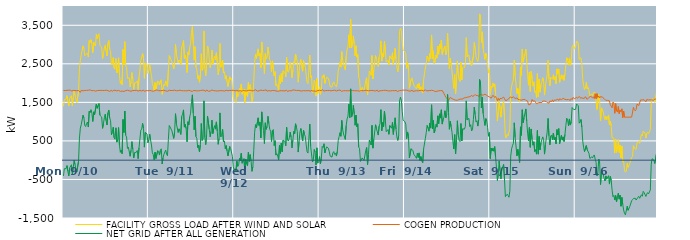
| Category | FACILITY GROSS LOAD AFTER WIND AND SOLAR | COGEN PRODUCTION | NET GRID AFTER ALL GENERATION |
|---|---|---|---|
|  Mon  9/10 | 1402 | 1811 | -409 |
|  Mon  9/10 | 1571 | 1792 | -221 |
|  Mon  9/10 | 1563 | 1806 | -243 |
|  Mon  9/10 | 1587 | 1807 | -220 |
|  Mon  9/10 | 1673 | 1813 | -140 |
|  Mon  9/10 | 1524 | 1812 | -288 |
|  Mon  9/10 | 1406 | 1814 | -408 |
|  Mon  9/10 | 1601 | 1801 | -200 |
|  Mon  9/10 | 1600 | 1819 | -219 |
|  Mon  9/10 | 1674 | 1792 | -118 |
|  Mon  9/10 | 1409 | 1793 | -384 |
|  Mon  9/10 | 1620 | 1809 | -189 |
|  Mon  9/10 | 1791 | 1793 | -2 |
|  Mon  9/10 | 1692 | 1805 | -113 |
|  Mon  9/10 | 1586 | 1807 | -221 |
|  Mon  9/10 | 1495 | 1803 | -308 |
|  Mon  9/10 | 1517 | 1806 | -289 |
|  Mon  9/10 | 1781 | 1807 | -26 |
|  Mon  9/10 | 2385 | 1811 | 574 |
|  Mon  9/10 | 2591 | 1760 | 831 |
|  Mon  9/10 | 2730 | 1811 | 919 |
|  Mon  9/10 | 2745 | 1807 | 938 |
|  Mon  9/10 | 2965 | 1799 | 1166 |
|  Mon  9/10 | 2897 | 1798 | 1099 |
|  Mon  9/10 | 2711 | 1810 | 901 |
|  Mon  9/10 | 2691 | 1819 | 872 |
|  Mon  9/10 | 2758 | 1809 | 949 |
|  Mon  9/10 | 2785 | 1795 | 990 |
|  Mon  9/10 | 2675 | 1815 | 860 |
|  Mon  9/10 | 3101 | 1830 | 1271 |
|  Mon  9/10 | 3053 | 1822 | 1231 |
|  Mon  9/10 | 3128 | 1816 | 1312 |
|  Mon  9/10 | 3024 | 1803 | 1221 |
|  Mon  9/10 | 2791 | 1787 | 1004 |
|  Mon  9/10 | 3061 | 1807 | 1254 |
|  Mon  9/10 | 2989 | 1809 | 1180 |
|  Mon  9/10 | 2958 | 1791 | 1167 |
|  Mon  9/10 | 3271 | 1815 | 1456 |
|  Mon  9/10 | 3151 | 1805 | 1346 |
|  Mon  9/10 | 3233 | 1816 | 1417 |
|  Mon  9/10 | 3281 | 1811 | 1470 |
|  Mon  9/10 | 2977 | 1811 | 1166 |
|  Mon  9/10 | 2992 | 1809 | 1183 |
|  Mon  9/10 | 2933 | 1813 | 1120 |
|  Mon  9/10 | 2636 | 1810 | 826 |
|  Mon  9/10 | 2767 | 1813 | 954 |
|  Mon  9/10 | 2909 | 1807 | 1102 |
|  Mon  9/10 | 2980 | 1788 | 1192 |
|  Mon  9/10 | 2840 | 1816 | 1024 |
|  Mon  9/10 | 2704 | 1792 | 912 |
|  Mon  9/10 | 3032 | 1806 | 1226 |
|  Mon  9/10 | 3105 | 1806 | 1299 |
|  Mon  9/10 | 2882 | 1785 | 1097 |
|  Mon  9/10 | 2820 | 1797 | 1023 |
|  Mon  9/10 | 2474 | 1815 | 659 |
|  Mon  9/10 | 2525 | 1783 | 742 |
|  Mon  9/10 | 2663 | 1809 | 854 |
|  Mon  9/10 | 2389 | 1806 | 583 |
|  Mon  9/10 | 2359 | 1815 | 544 |
|  Mon  9/10 | 2638 | 1798 | 840 |
|  Mon  9/10 | 2266 | 1798 | 468 |
|  Mon  9/10 | 2331 | 1810 | 521 |
|  Mon  9/10 | 2659 | 1811 | 848 |
|  Mon  9/10 | 2204 | 1814 | 390 |
|  Mon  9/10 | 1990 | 1785 | 205 |
|  Mon  9/10 | 2065 | 1801 | 264 |
|  Mon  9/10 | 1959 | 1793 | 166 |
|  Mon  9/10 | 2874 | 1818 | 1056 |
|  Mon  9/10 | 2500 | 1783 | 717 |
|  Mon  9/10 | 3074 | 1799 | 1275 |
|  Mon  9/10 | 2450 | 1805 | 645 |
|  Mon  9/10 | 2410 | 1808 | 602 |
|  Mon  9/10 | 2120 | 1815 | 305 |
|  Mon  9/10 | 2144 | 1806 | 338 |
|  Mon  9/10 | 2139 | 1800 | 339 |
|  Mon  9/10 | 1903 | 1801 | 102 |
|  Mon  9/10 | 2045 | 1789 | 256 |
|  Mon  9/10 | 2275 | 1794 | 481 |
|  Mon  9/10 | 2090 | 1807 | 283 |
|  Mon  9/10 | 1838 | 1782 | 56 |
|  Mon  9/10 | 2002 | 1807 | 195 |
|  Mon  9/10 | 2020 | 1802 | 218 |
|  Mon  9/10 | 2018 | 1811 | 207 |
|  Mon  9/10 | 2059 | 1809 | 250 |
|  Mon  9/10 | 1834 | 1794 | 40 |
|  Mon  9/10 | 2131 | 1805 | 326 |
|  Mon  9/10 | 2116 | 1809 | 307 |
|  Mon  9/10 | 2580 | 1803 | 777 |
|  Mon  9/10 | 2602 | 1795 | 807 |
|  Mon  9/10 | 2764 | 1810 | 954 |
|  Mon  9/10 | 2648 | 1820 | 828 |
|  Mon  9/10 | 2124 | 1786 | 338 |
|  Mon  9/10 | 2520 | 1799 | 721 |
|  Mon  9/10 | 2509 | 1806 | 703 |
|  Mon  9/10 | 2490 | 1809 | 681 |
|  Mon  9/10 | 2253 | 1802 | 451 |
|  Tue  9/11 | 2324 | 1797 | 527 |
|  Tue  9/11 | 2486 | 1810 | 676 |
|  Tue  9/11 | 2321 | 1799 | 522 |
|  Tue  9/11 | 2194 | 1800 | 394 |
|  Tue  9/11 | 1988 | 1797 | 191 |
|  Tue  9/11 | 1931 | 1787 | 144 |
|  Tue  9/11 | 1807 | 1797 | 10 |
|  Tue  9/11 | 2014 | 1806 | 208 |
|  Tue  9/11 | 1838 | 1795 | 43 |
|  Tue  9/11 | 1860 | 1822 | 38 |
|  Tue  9/11 | 2057 | 1811 | 246 |
|  Tue  9/11 | 2021 | 1803 | 218 |
|  Tue  9/11 | 1949 | 1816 | 133 |
|  Tue  9/11 | 2056 | 1802 | 254 |
|  Tue  9/11 | 2087 | 1792 | 295 |
|  Tue  9/11 | 1708 | 1807 | -99 |
|  Tue  9/11 | 1872 | 1811 | 61 |
|  Tue  9/11 | 1969 | 1815 | 154 |
|  Tue  9/11 | 1930 | 1798 | 132 |
|  Tue  9/11 | 2058 | 1797 | 261 |
|  Tue  9/11 | 1967 | 1813 | 154 |
|  Tue  9/11 | 1903 | 1788 | 115 |
|  Tue  9/11 | 2340 | 1806 | 534 |
|  Tue  9/11 | 2713 | 1814 | 899 |
|  Tue  9/11 | 2654 | 1795 | 859 |
|  Tue  9/11 | 2677 | 1807 | 870 |
|  Tue  9/11 | 2561 | 1800 | 761 |
|  Tue  9/11 | 2554 | 1809 | 745 |
|  Tue  9/11 | 2366 | 1801 | 565 |
|  Tue  9/11 | 2540 | 1817 | 723 |
|  Tue  9/11 | 3005 | 1799 | 1206 |
|  Tue  9/11 | 2749 | 1801 | 948 |
|  Tue  9/11 | 2769 | 1818 | 951 |
|  Tue  9/11 | 2525 | 1806 | 719 |
|  Tue  9/11 | 2598 | 1784 | 814 |
|  Tue  9/11 | 2554 | 1815 | 739 |
|  Tue  9/11 | 2471 | 1803 | 668 |
|  Tue  9/11 | 2940 | 1803 | 1137 |
|  Tue  9/11 | 2989 | 1798 | 1191 |
|  Tue  9/11 | 3107 | 1802 | 1305 |
|  Tue  9/11 | 2641 | 1783 | 858 |
|  Tue  9/11 | 2730 | 1801 | 929 |
|  Tue  9/11 | 2631 | 1815 | 816 |
|  Tue  9/11 | 2274 | 1797 | 477 |
|  Tue  9/11 | 2806 | 1809 | 997 |
|  Tue  9/11 | 2732 | 1815 | 917 |
|  Tue  9/11 | 2929 | 1806 | 1123 |
|  Tue  9/11 | 3016 | 1797 | 1219 |
|  Tue  9/11 | 3313 | 1794 | 1519 |
|  Tue  9/11 | 3475 | 1780 | 1695 |
|  Tue  9/11 | 3019 | 1809 | 1210 |
|  Tue  9/11 | 2595 | 1807 | 788 |
|  Tue  9/11 | 2946 | 1805 | 1141 |
|  Tue  9/11 | 2408 | 1795 | 613 |
|  Tue  9/11 | 2365 | 1798 | 567 |
|  Tue  9/11 | 2111 | 1785 | 326 |
|  Tue  9/11 | 2192 | 1800 | 392 |
|  Tue  9/11 | 2021 | 1807 | 214 |
|  Tue  9/11 | 2210 | 1806 | 404 |
|  Tue  9/11 | 2760 | 1809 | 951 |
|  Tue  9/11 | 2327 | 1815 | 512 |
|  Tue  9/11 | 2364 | 1802 | 562 |
|  Tue  9/11 | 3353 | 1814 | 1539 |
|  Tue  9/11 | 2384 | 1794 | 590 |
|  Tue  9/11 | 2189 | 1785 | 404 |
|  Tue  9/11 | 2479 | 1822 | 657 |
|  Tue  9/11 | 2963 | 1816 | 1147 |
|  Tue  9/11 | 2924 | 1789 | 1135 |
|  Tue  9/11 | 2601 | 1804 | 797 |
|  Tue  9/11 | 2399 | 1792 | 607 |
|  Tue  9/11 | 2536 | 1790 | 746 |
|  Tue  9/11 | 2860 | 1821 | 1039 |
|  Tue  9/11 | 2493 | 1802 | 691 |
|  Tue  9/11 | 2622 | 1805 | 817 |
|  Tue  9/11 | 2696 | 1799 | 897 |
|  Tue  9/11 | 2605 | 1800 | 805 |
|  Tue  9/11 | 2787 | 1794 | 993 |
|  Tue  9/11 | 2545 | 1794 | 751 |
|  Tue  9/11 | 2216 | 1805 | 411 |
|  Tue  9/11 | 2364 | 1801 | 563 |
|  Tue  9/11 | 3027 | 1800 | 1227 |
|  Tue  9/11 | 2410 | 1804 | 606 |
|  Tue  9/11 | 2430 | 1795 | 635 |
|  Tue  9/11 | 2599 | 1802 | 797 |
|  Tue  9/11 | 2260 | 1788 | 472 |
|  Tue  9/11 | 2294 | 1794 | 500 |
|  Tue  9/11 | 2103 | 1808 | 295 |
|  Tue  9/11 | 2194 | 1814 | 380 |
|  Tue  9/11 | 2039 | 1799 | 240 |
|  Tue  9/11 | 1908 | 1800 | 108 |
|  Tue  9/11 | 1913 | 1794 | 119 |
|  Tue  9/11 | 2164 | 1809 | 355 |
|  Tue  9/11 | 2097 | 1794 | 303 |
|  Tue  9/11 | 2124 | 1810 | 314 |
|  Tue  9/11 | 1905 | 1805 | 100 |
|  Tue  9/11 | 1642 | 1814 | -172 |
|  Wed  9/12 | 1556 | 1814 | -258 |
|  Wed  9/12 | 1581 | 1800 | -219 |
|  Wed  9/12 | 1496 | 1791 | -295 |
|  Wed  9/12 | 1783 | 1806 | -23 |
|  Wed  9/12 | 1647 | 1809 | -162 |
|  Wed  9/12 | 1675 | 1797 | -122 |
|  Wed  9/12 | 1856 | 1812 | 44 |
|  Wed  9/12 | 1784 | 1801 | -17 |
|  Wed  9/12 | 1978 | 1799 | 179 |
|  Wed  9/12 | 1709 | 1788 | -79 |
|  Wed  9/12 | 1713 | 1814 | -101 |
|  Wed  9/12 | 1841 | 1804 | 37 |
|  Wed  9/12 | 1495 | 1800 | -305 |
|  Wed  9/12 | 1826 | 1795 | 31 |
|  Wed  9/12 | 1703 | 1796 | -93 |
|  Wed  9/12 | 1651 | 1801 | -150 |
|  Wed  9/12 | 2017 | 1809 | 208 |
|  Wed  9/12 | 1764 | 1797 | -33 |
|  Wed  9/12 | 1960 | 1816 | 144 |
|  Wed  9/12 | 1784 | 1810 | -26 |
|  Wed  9/12 | 1509 | 1798 | -289 |
|  Wed  9/12 | 1621 | 1791 | -170 |
|  Wed  9/12 | 2050 | 1805 | 245 |
|  Wed  9/12 | 2532 | 1808 | 724 |
|  Wed  9/12 | 2748 | 1827 | 921 |
|  Wed  9/12 | 2639 | 1803 | 836 |
|  Wed  9/12 | 2627 | 1792 | 835 |
|  Wed  9/12 | 2888 | 1790 | 1098 |
|  Wed  9/12 | 2702 | 1800 | 902 |
|  Wed  9/12 | 2767 | 1785 | 982 |
|  Wed  9/12 | 2395 | 1817 | 578 |
|  Wed  9/12 | 3067 | 1814 | 1253 |
|  Wed  9/12 | 2809 | 1807 | 1002 |
|  Wed  9/12 | 2579 | 1806 | 773 |
|  Wed  9/12 | 2243 | 1813 | 430 |
|  Wed  9/12 | 2769 | 1799 | 970 |
|  Wed  9/12 | 2623 | 1824 | 799 |
|  Wed  9/12 | 2659 | 1790 | 869 |
|  Wed  9/12 | 2935 | 1798 | 1137 |
|  Wed  9/12 | 2756 | 1805 | 951 |
|  Wed  9/12 | 2597 | 1794 | 803 |
|  Wed  9/12 | 2549 | 1796 | 753 |
|  Wed  9/12 | 2287 | 1803 | 484 |
|  Wed  9/12 | 2577 | 1808 | 769 |
|  Wed  9/12 | 2589 | 1794 | 795 |
|  Wed  9/12 | 2186 | 1806 | 380 |
|  Wed  9/12 | 2298 | 1792 | 506 |
|  Wed  9/12 | 1930 | 1798 | 132 |
|  Wed  9/12 | 1968 | 1801 | 167 |
|  Wed  9/12 | 1887 | 1786 | 101 |
|  Wed  9/12 | 1811 | 1802 | 9 |
|  Wed  9/12 | 2192 | 1799 | 393 |
|  Wed  9/12 | 1983 | 1808 | 175 |
|  Wed  9/12 | 2250 | 1804 | 446 |
|  Wed  9/12 | 2028 | 1810 | 218 |
|  Wed  9/12 | 2320 | 1800 | 520 |
|  Wed  9/12 | 2328 | 1808 | 520 |
|  Wed  9/12 | 2284 | 1797 | 487 |
|  Wed  9/12 | 2162 | 1790 | 372 |
|  Wed  9/12 | 2666 | 1815 | 851 |
|  Wed  9/12 | 2312 | 1781 | 531 |
|  Wed  9/12 | 2281 | 1785 | 496 |
|  Wed  9/12 | 2381 | 1803 | 578 |
|  Wed  9/12 | 2546 | 1816 | 730 |
|  Wed  9/12 | 2392 | 1798 | 594 |
|  Wed  9/12 | 2139 | 1820 | 319 |
|  Wed  9/12 | 2341 | 1820 | 521 |
|  Wed  9/12 | 2553 | 1806 | 747 |
|  Wed  9/12 | 2502 | 1819 | 683 |
|  Wed  9/12 | 2753 | 1809 | 944 |
|  Wed  9/12 | 2664 | 1806 | 858 |
|  Wed  9/12 | 2553 | 1811 | 742 |
|  Wed  9/12 | 2023 | 1812 | 211 |
|  Wed  9/12 | 2282 | 1803 | 479 |
|  Wed  9/12 | 2533 | 1802 | 731 |
|  Wed  9/12 | 2614 | 1793 | 821 |
|  Wed  9/12 | 2616 | 1793 | 823 |
|  Wed  9/12 | 2307 | 1810 | 497 |
|  Wed  9/12 | 2584 | 1806 | 778 |
|  Wed  9/12 | 2475 | 1805 | 670 |
|  Wed  9/12 | 2411 | 1800 | 611 |
|  Wed  9/12 | 2200 | 1806 | 394 |
|  Wed  9/12 | 2024 | 1804 | 220 |
|  Wed  9/12 | 1985 | 1800 | 185 |
|  Wed  9/12 | 2005 | 1804 | 201 |
|  Wed  9/12 | 2726 | 1789 | 937 |
|  Wed  9/12 | 2147 | 1788 | 359 |
|  Wed  9/12 | 2190 | 1820 | 370 |
|  Wed  9/12 | 1745 | 1791 | -46 |
|  Wed  9/12 | 1805 | 1796 | 9 |
|  Wed  9/12 | 2073 | 1797 | 276 |
|  Wed  9/12 | 2016 | 1801 | 215 |
|  Wed  9/12 | 1661 | 1786 | -125 |
|  Wed  9/12 | 2120 | 1800 | 320 |
|  Wed  9/12 | 1729 | 1806 | -77 |
|  Wed  9/12 | 1755 | 1791 | -36 |
|  Thu  9/13 | 1907 | 1814 | 93 |
|  Thu  9/13 | 1709 | 1806 | -97 |
|  Thu  9/13 | 1835 | 1801 | 34 |
|  Thu  9/13 | 2189 | 1832 | 357 |
|  Thu  9/13 | 2139 | 1810 | 329 |
|  Thu  9/13 | 2218 | 1792 | 426 |
|  Thu  9/13 | 1991 | 1801 | 190 |
|  Thu  9/13 | 2090 | 1808 | 282 |
|  Thu  9/13 | 2151 | 1806 | 345 |
|  Thu  9/13 | 2138 | 1807 | 331 |
|  Thu  9/13 | 2120 | 1811 | 309 |
|  Thu  9/13 | 2025 | 1809 | 216 |
|  Thu  9/13 | 1908 | 1803 | 105 |
|  Thu  9/13 | 1928 | 1799 | 129 |
|  Thu  9/13 | 1897 | 1817 | 80 |
|  Thu  9/13 | 1997 | 1809 | 188 |
|  Thu  9/13 | 2032 | 1810 | 222 |
|  Thu  9/13 | 1963 | 1814 | 149 |
|  Thu  9/13 | 1976 | 1798 | 178 |
|  Thu  9/13 | 1903 | 1796 | 107 |
|  Thu  9/13 | 2021 | 1792 | 229 |
|  Thu  9/13 | 2321 | 1812 | 509 |
|  Thu  9/13 | 2409 | 1799 | 610 |
|  Thu  9/13 | 2531 | 1819 | 712 |
|  Thu  9/13 | 2415 | 1794 | 621 |
|  Thu  9/13 | 2816 | 1785 | 1031 |
|  Thu  9/13 | 2592 | 1797 | 795 |
|  Thu  9/13 | 2483 | 1804 | 679 |
|  Thu  9/13 | 2466 | 1803 | 663 |
|  Thu  9/13 | 2342 | 1802 | 540 |
|  Thu  9/13 | 2695 | 1796 | 899 |
|  Thu  9/13 | 2873 | 1801 | 1072 |
|  Thu  9/13 | 2951 | 1807 | 1144 |
|  Thu  9/13 | 3256 | 1802 | 1454 |
|  Thu  9/13 | 2914 | 1813 | 1101 |
|  Thu  9/13 | 3655 | 1805 | 1850 |
|  Thu  9/13 | 2916 | 1797 | 1119 |
|  Thu  9/13 | 3005 | 1807 | 1198 |
|  Thu  9/13 | 3225 | 1801 | 1424 |
|  Thu  9/13 | 3005 | 1804 | 1201 |
|  Thu  9/13 | 2705 | 1799 | 906 |
|  Thu  9/13 | 2970 | 1800 | 1170 |
|  Thu  9/13 | 2673 | 1806 | 867 |
|  Thu  9/13 | 2744 | 1801 | 943 |
|  Thu  9/13 | 2149 | 1807 | 342 |
|  Thu  9/13 | 2090 | 1791 | 299 |
|  Thu  9/13 | 1779 | 1811 | -32 |
|  Thu  9/13 | 1757 | 1808 | -51 |
|  Thu  9/13 | 1888 | 1828 | 60 |
|  Thu  9/13 | 1869 | 1799 | 70 |
|  Thu  9/13 | 1797 | 1806 | -9 |
|  Thu  9/13 | 1810 | 1812 | -2 |
|  Thu  9/13 | 2062 | 1807 | 255 |
|  Thu  9/13 | 2139 | 1810 | 329 |
|  Thu  9/13 | 1698 | 1812 | -114 |
|  Thu  9/13 | 1946 | 1800 | 146 |
|  Thu  9/13 | 2315 | 1794 | 521 |
|  Thu  9/13 | 2269 | 1807 | 462 |
|  Thu  9/13 | 2201 | 1808 | 393 |
|  Thu  9/13 | 2713 | 1811 | 902 |
|  Thu  9/13 | 2108 | 1796 | 312 |
|  Thu  9/13 | 2343 | 1804 | 539 |
|  Thu  9/13 | 2330 | 1800 | 530 |
|  Thu  9/13 | 2714 | 1795 | 919 |
|  Thu  9/13 | 2619 | 1803 | 816 |
|  Thu  9/13 | 2618 | 1816 | 802 |
|  Thu  9/13 | 2432 | 1780 | 652 |
|  Thu  9/13 | 2675 | 1793 | 882 |
|  Thu  9/13 | 2750 | 1802 | 948 |
|  Thu  9/13 | 3095 | 1784 | 1311 |
|  Thu  9/13 | 2568 | 1804 | 764 |
|  Thu  9/13 | 2782 | 1804 | 978 |
|  Thu  9/13 | 2675 | 1810 | 865 |
|  Thu  9/13 | 3080 | 1809 | 1271 |
|  Thu  9/13 | 2857 | 1814 | 1043 |
|  Thu  9/13 | 2543 | 1804 | 739 |
|  Thu  9/13 | 2552 | 1804 | 748 |
|  Thu  9/13 | 2593 | 1799 | 794 |
|  Thu  9/13 | 2467 | 1796 | 671 |
|  Thu  9/13 | 2705 | 1805 | 900 |
|  Thu  9/13 | 2701 | 1798 | 903 |
|  Thu  9/13 | 2617 | 1788 | 829 |
|  Thu  9/13 | 2787 | 1805 | 982 |
|  Thu  9/13 | 2470 | 1802 | 668 |
|  Thu  9/13 | 2704 | 1802 | 902 |
|  Thu  9/13 | 2902 | 1802 | 1100 |
|  Thu  9/13 | 2615 | 1808 | 807 |
|  Thu  9/13 | 2404 | 1801 | 603 |
|  Thu  9/13 | 2295 | 1782 | 513 |
|  Thu  9/13 | 2446 | 1806 | 640 |
|  Thu  9/13 | 3345 | 1807 | 1538 |
|  Thu  9/13 | 3422 | 1789 | 1633 |
|  Thu  9/13 | 3367 | 1810 | 1557 |
|  Thu  9/13 | 3064 | 1805 | 1259 |
|  Thu  9/13 | 2855 | 1818 | 1037 |
|  Thu  9/13 | 2838 | 1803 | 1035 |
|  Fri  9/14 | 2814 | 1816 | 998 |
|  Fri  9/14 | 2751 | 1818 | 933 |
|  Fri  9/14 | 2378 | 1818 | 560 |
|  Fri  9/14 | 2527 | 1794 | 733 |
|  Fri  9/14 | 2429 | 1799 | 630 |
|  Fri  9/14 | 1867 | 1811 | 56 |
|  Fri  9/14 | 1856 | 1789 | 67 |
|  Fri  9/14 | 2099 | 1802 | 297 |
|  Fri  9/14 | 2135 | 1819 | 316 |
|  Fri  9/14 | 2030 | 1783 | 247 |
|  Fri  9/14 | 1953 | 1799 | 154 |
|  Fri  9/14 | 1969 | 1795 | 174 |
|  Fri  9/14 | 1877 | 1787 | 90 |
|  Fri  9/14 | 1850 | 1802 | 48 |
|  Fri  9/14 | 1971 | 1789 | 182 |
|  Fri  9/14 | 1869 | 1798 | 71 |
|  Fri  9/14 | 1997 | 1808 | 189 |
|  Fri  9/14 | 1806 | 1812 | -6 |
|  Fri  9/14 | 1904 | 1810 | 94 |
|  Fri  9/14 | 1798 | 1814 | -16 |
|  Fri  9/14 | 1741 | 1808 | -67 |
|  Fri  9/14 | 2082 | 1794 | 288 |
|  Fri  9/14 | 2094 | 1793 | 301 |
|  Fri  9/14 | 2393 | 1828 | 565 |
|  Fri  9/14 | 2515 | 1801 | 714 |
|  Fri  9/14 | 2701 | 1799 | 902 |
|  Fri  9/14 | 2635 | 1800 | 835 |
|  Fri  9/14 | 2564 | 1812 | 752 |
|  Fri  9/14 | 2772 | 1807 | 965 |
|  Fri  9/14 | 2636 | 1804 | 832 |
|  Fri  9/14 | 3249 | 1812 | 1437 |
|  Fri  9/14 | 2631 | 1817 | 814 |
|  Fri  9/14 | 2838 | 1807 | 1031 |
|  Fri  9/14 | 2508 | 1803 | 705 |
|  Fri  9/14 | 2573 | 1780 | 793 |
|  Fri  9/14 | 2728 | 1798 | 930 |
|  Fri  9/14 | 2646 | 1788 | 858 |
|  Fri  9/14 | 2963 | 1812 | 1151 |
|  Fri  9/14 | 2748 | 1800 | 948 |
|  Fri  9/14 | 3011 | 1809 | 1202 |
|  Fri  9/14 | 2896 | 1804 | 1092 |
|  Fri  9/14 | 3118 | 1810 | 1308 |
|  Fri  9/14 | 2744 | 1808 | 936 |
|  Fri  9/14 | 2850 | 1785 | 1065 |
|  Fri  9/14 | 2838 | 1722 | 1116 |
|  Fri  9/14 | 2963 | 1681 | 1282 |
|  Fri  9/14 | 2731 | 1631 | 1100 |
|  Fri  9/14 | 2810 | 1621 | 1189 |
|  Fri  9/14 | 3295 | 1589 | 1706 |
|  Fri  9/14 | 2786 | 1547 | 1239 |
|  Fri  9/14 | 2373 | 1571 | 802 |
|  Fri  9/14 | 2640 | 1630 | 1010 |
|  Fri  9/14 | 2478 | 1609 | 869 |
|  Fri  9/14 | 2317 | 1596 | 721 |
|  Fri  9/14 | 2070 | 1588 | 482 |
|  Fri  9/14 | 1862 | 1573 | 289 |
|  Fri  9/14 | 2226 | 1563 | 663 |
|  Fri  9/14 | 1719 | 1558 | 161 |
|  Fri  9/14 | 2069 | 1535 | 534 |
|  Fri  9/14 | 2575 | 1553 | 1022 |
|  Fri  9/14 | 2218 | 1558 | 660 |
|  Fri  9/14 | 2090 | 1576 | 514 |
|  Fri  9/14 | 2044 | 1562 | 482 |
|  Fri  9/14 | 2538 | 1586 | 952 |
|  Fri  9/14 | 2083 | 1584 | 499 |
|  Fri  9/14 | 2401 | 1586 | 815 |
|  Fri  9/14 | 2429 | 1613 | 816 |
|  Fri  9/14 | 2400 | 1594 | 806 |
|  Fri  9/14 | 2499 | 1622 | 877 |
|  Fri  9/14 | 3179 | 1641 | 1538 |
|  Fri  9/14 | 2678 | 1634 | 1044 |
|  Fri  9/14 | 2697 | 1646 | 1051 |
|  Fri  9/14 | 2725 | 1641 | 1084 |
|  Fri  9/14 | 2533 | 1663 | 870 |
|  Fri  9/14 | 2578 | 1656 | 922 |
|  Fri  9/14 | 2447 | 1686 | 761 |
|  Fri  9/14 | 2444 | 1654 | 790 |
|  Fri  9/14 | 2701 | 1646 | 1055 |
|  Fri  9/14 | 3054 | 1678 | 1376 |
|  Fri  9/14 | 2891 | 1705 | 1186 |
|  Fri  9/14 | 2667 | 1677 | 990 |
|  Fri  9/14 | 2686 | 1662 | 1024 |
|  Fri  9/14 | 2563 | 1679 | 884 |
|  Fri  9/14 | 2699 | 1646 | 1053 |
|  Fri  9/14 | 3796 | 1701 | 2095 |
|  Fri  9/14 | 3729 | 1723 | 2006 |
|  Fri  9/14 | 3053 | 1697 | 1356 |
|  Fri  9/14 | 3330 | 1695 | 1635 |
|  Fri  9/14 | 2895 | 1687 | 1208 |
|  Fri  9/14 | 2902 | 1703 | 1199 |
|  Fri  9/14 | 2615 | 1713 | 902 |
|  Fri  9/14 | 2772 | 1694 | 1078 |
|  Fri  9/14 | 2708 | 1687 | 1021 |
|  Fri  9/14 | 2509 | 1660 | 849 |
|  Fri  9/14 | 2263 | 1641 | 622 |
|  Fri  9/14 | 2357 | 1641 | 716 |
|  Sat  9/15 | 1697 | 1656 | 41 |
|  Sat  9/15 | 1924 | 1610 | 314 |
|  Sat  9/15 | 1881 | 1644 | 237 |
|  Sat  9/15 | 2002 | 1684 | 318 |
|  Sat  9/15 | 1909 | 1677 | 232 |
|  Sat  9/15 | 1979 | 1627 | 352 |
|  Sat  9/15 | 1728 | 1653 | 75 |
|  Sat  9/15 | 1403 | 1602 | -199 |
|  Sat  9/15 | 1014 | 1541 | -527 |
|  Sat  9/15 | 1246 | 1606 | -360 |
|  Sat  9/15 | 1531 | 1554 | -23 |
|  Sat  9/15 | 1324 | 1599 | -275 |
|  Sat  9/15 | 1116 | 1605 | -489 |
|  Sat  9/15 | 1396 | 1603 | -207 |
|  Sat  9/15 | 1437 | 1608 | -171 |
|  Sat  9/15 | 1526 | 1637 | -111 |
|  Sat  9/15 | 1113 | 1601 | -488 |
|  Sat  9/15 | 602 | 1549 | -947 |
|  Sat  9/15 | 574 | 1542 | -968 |
|  Sat  9/15 | 671 | 1554 | -883 |
|  Sat  9/15 | 633 | 1550 | -917 |
|  Sat  9/15 | 646 | 1608 | -962 |
|  Sat  9/15 | 817 | 1622 | -805 |
|  Sat  9/15 | 1749 | 1642 | 107 |
|  Sat  9/15 | 1910 | 1614 | 296 |
|  Sat  9/15 | 2012 | 1636 | 376 |
|  Sat  9/15 | 2082 | 1643 | 439 |
|  Sat  9/15 | 2597 | 1628 | 969 |
|  Sat  9/15 | 2190 | 1601 | 589 |
|  Sat  9/15 | 2177 | 1602 | 575 |
|  Sat  9/15 | 1724 | 1615 | 109 |
|  Sat  9/15 | 1861 | 1581 | 280 |
|  Sat  9/15 | 1701 | 1573 | 128 |
|  Sat  9/15 | 1505 | 1567 | -62 |
|  Sat  9/15 | 2420 | 1555 | 865 |
|  Sat  9/15 | 2201 | 1557 | 644 |
|  Sat  9/15 | 2885 | 1577 | 1308 |
|  Sat  9/15 | 2544 | 1573 | 971 |
|  Sat  9/15 | 2659 | 1556 | 1103 |
|  Sat  9/15 | 2682 | 1579 | 1103 |
|  Sat  9/15 | 2881 | 1551 | 1330 |
|  Sat  9/15 | 2559 | 1549 | 1010 |
|  Sat  9/15 | 2232 | 1533 | 699 |
|  Sat  9/15 | 1946 | 1439 | 507 |
|  Sat  9/15 | 2288 | 1441 | 847 |
|  Sat  9/15 | 1783 | 1449 | 334 |
|  Sat  9/15 | 2304 | 1494 | 810 |
|  Sat  9/15 | 2122 | 1576 | 546 |
|  Sat  9/15 | 1921 | 1532 | 389 |
|  Sat  9/15 | 2033 | 1556 | 477 |
|  Sat  9/15 | 1763 | 1539 | 224 |
|  Sat  9/15 | 1796 | 1522 | 274 |
|  Sat  9/15 | 1621 | 1465 | 156 |
|  Sat  9/15 | 2246 | 1476 | 770 |
|  Sat  9/15 | 1644 | 1488 | 156 |
|  Sat  9/15 | 2101 | 1484 | 617 |
|  Sat  9/15 | 1764 | 1498 | 266 |
|  Sat  9/15 | 1958 | 1511 | 447 |
|  Sat  9/15 | 2032 | 1496 | 536 |
|  Sat  9/15 | 2138 | 1533 | 605 |
|  Sat  9/15 | 2043 | 1511 | 532 |
|  Sat  9/15 | 1688 | 1531 | 157 |
|  Sat  9/15 | 1919 | 1522 | 397 |
|  Sat  9/15 | 1896 | 1522 | 374 |
|  Sat  9/15 | 2224 | 1495 | 729 |
|  Sat  9/15 | 2587 | 1505 | 1082 |
|  Sat  9/15 | 2109 | 1479 | 630 |
|  Sat  9/15 | 1930 | 1533 | 397 |
|  Sat  9/15 | 2149 | 1524 | 625 |
|  Sat  9/15 | 2173 | 1520 | 653 |
|  Sat  9/15 | 2101 | 1567 | 534 |
|  Sat  9/15 | 2220 | 1515 | 705 |
|  Sat  9/15 | 2084 | 1557 | 527 |
|  Sat  9/15 | 2171 | 1577 | 594 |
|  Sat  9/15 | 1982 | 1558 | 424 |
|  Sat  9/15 | 2370 | 1576 | 794 |
|  Sat  9/15 | 2239 | 1585 | 654 |
|  Sat  9/15 | 2367 | 1548 | 819 |
|  Sat  9/15 | 2021 | 1592 | 429 |
|  Sat  9/15 | 2004 | 1580 | 424 |
|  Sat  9/15 | 2214 | 1571 | 643 |
|  Sat  9/15 | 2101 | 1581 | 520 |
|  Sat  9/15 | 2209 | 1605 | 604 |
|  Sat  9/15 | 2072 | 1587 | 485 |
|  Sat  9/15 | 2245 | 1577 | 668 |
|  Sat  9/15 | 2481 | 1578 | 903 |
|  Sat  9/15 | 2659 | 1570 | 1089 |
|  Sat  9/15 | 2592 | 1551 | 1041 |
|  Sat  9/15 | 2465 | 1574 | 891 |
|  Sat  9/15 | 2653 | 1583 | 1070 |
|  Sat  9/15 | 2462 | 1551 | 911 |
|  Sat  9/15 | 2585 | 1598 | 987 |
|  Sat  9/15 | 2936 | 1569 | 1367 |
|  Sat  9/15 | 2984 | 1625 | 1359 |
|  Sat  9/15 | 2949 | 1638 | 1311 |
|  Sat  9/15 | 2889 | 1595 | 1294 |
|  Sun  9/16 | 2937 | 1615 | 1322 |
|  Sun  9/16 | 3093 | 1634 | 1459 |
|  Sun  9/16 | 3072 | 1605 | 1467 |
|  Sun  9/16 | 3039 | 1628 | 1411 |
|  Sun  9/16 | 2614 | 1654 | 960 |
|  Sun  9/16 | 2624 | 1632 | 992 |
|  Sun  9/16 | 2658 | 1602 | 1056 |
|  Sun  9/16 | 2486 | 1629 | 857 |
|  Sun  9/16 | 2092 | 1600 | 492 |
|  Sun  9/16 | 1934 | 1609 | 325 |
|  Sun  9/16 | 1832 | 1609 | 223 |
|  Sun  9/16 | 1863 | 1648 | 215 |
|  Sun  9/16 | 2018 | 1640 | 378 |
|  Sun  9/16 | 1848 | 1577 | 271 |
|  Sun  9/16 | 1885 | 1595 | 290 |
|  Sun  9/16 | 1807 | 1630 | 177 |
|  Sun  9/16 | 1665 | 1622 | 43 |
|  Sun  9/16 | 1691 | 1656 | 35 |
|  Sun  9/16 | 1721 | 1635 | 86 |
|  Sun  9/16 | 1672 | 1617 | 55 |
|  Sun  9/16 | 1754 | 1645 | 109 |
|  Sun  9/16 | 1736 | 1600 | 136 |
|  Sun  9/16 | 1751 | 1724 | 27 |
|  Sun  9/16 | 1539 | 1597 | -58 |
|  Sun  9/16 | 1316 | 1724 | -408 |
|  Sun  9/16 | 1307 | 1630 | -323 |
|  Sun  9/16 | 1698 | 1668 | 30 |
|  Sun  9/16 | 1544 | 1614 | -70 |
|  Sun  9/16 | 1017 | 1650 | -633 |
|  Sun  9/16 | 1356 | 1658 | -302 |
|  Sun  9/16 | 1305 | 1636 | -331 |
|  Sun  9/16 | 1250 | 1613 | -363 |
|  Sun  9/16 | 1130 | 1598 | -468 |
|  Sun  9/16 | 1051 | 1591 | -540 |
|  Sun  9/16 | 1143 | 1551 | -408 |
|  Sun  9/16 | 1050 | 1545 | -495 |
|  Sun  9/16 | 1037 | 1552 | -515 |
|  Sun  9/16 | 1170 | 1571 | -401 |
|  Sun  9/16 | 919 | 1539 | -620 |
|  Sun  9/16 | 1016 | 1438 | -422 |
|  Sun  9/16 | 881 | 1402 | -521 |
|  Sun  9/16 | 578 | 1358 | -780 |
|  Sun  9/16 | 562 | 1509 | -947 |
|  Sun  9/16 | 568 | 1481 | -913 |
|  Sun  9/16 | 184 | 1216 | -1032 |
|  Sun  9/16 | 550 | 1467 | -917 |
|  Sun  9/16 | 198 | 1280 | -1082 |
|  Sun  9/16 | 311 | 1248 | -937 |
|  Sun  9/16 | 536 | 1391 | -855 |
|  Sun  9/16 | 198 | 1208 | -1010 |
|  Sun  9/16 | 392 | 1299 | -907 |
|  Sun  9/16 | 60 | 1255 | -1195 |
|  Sun  9/16 | 367 | 1333 | -966 |
|  Sun  9/16 | -47 | 1106 | -1153 |
|  Sun  9/16 | -20 | 1273 | -1293 |
|  Sun  9/16 | -269 | 1115 | -1384 |
|  Sun  9/16 | -311 | 1107 | -1418 |
|  Sun  9/16 | -284 | 1116 | -1400 |
|  Sun  9/16 | -80 | 1114 | -1194 |
|  Sun  9/16 | -186 | 1115 | -1301 |
|  Sun  9/16 | -198 | 1102 | -1300 |
|  Sun  9/16 | -77 | 1117 | -1194 |
|  Sun  9/16 | -96 | 1097 | -1193 |
|  Sun  9/16 | 67 | 1119 | -1052 |
|  Sun  9/16 | 94 | 1116 | -1022 |
|  Sun  9/16 | 375 | 1371 | -996 |
|  Sun  9/16 | 311 | 1310 | -999 |
|  Sun  9/16 | 294 | 1281 | -987 |
|  Sun  9/16 | 280 | 1314 | -1034 |
|  Sun  9/16 | 450 | 1453 | -1003 |
|  Sun  9/16 | 472 | 1436 | -964 |
|  Sun  9/16 | 480 | 1418 | -938 |
|  Sun  9/16 | 435 | 1424 | -989 |
|  Sun  9/16 | 567 | 1562 | -995 |
|  Sun  9/16 | 665 | 1562 | -897 |
|  Sun  9/16 | 627 | 1563 | -936 |
|  Sun  9/16 | 753 | 1562 | -809 |
|  Sun  9/16 | 729 | 1568 | -839 |
|  Sun  9/16 | 709 | 1570 | -861 |
|  Sun  9/16 | 573 | 1514 | -941 |
|  Sun  9/16 | 693 | 1574 | -881 |
|  Sun  9/16 | 728 | 1570 | -842 |
|  Sun  9/16 | 687 | 1561 | -874 |
|  Sun  9/16 | 734 | 1585 | -851 |
|  Sun  9/16 | 794 | 1566 | -772 |
|  Sun  9/16 | 1475 | 1579 | -104 |
|  Sun  9/16 | 1599 | 1562 | 37 |
|  Sun  9/16 | 1602 | 1583 | 19 |
|  Sun  9/16 | 1557 | 1555 | 2 |
|  Sun  9/16 | 1497 | 1583 | -86 |
|  Sun  9/16 | 1477 | 1564 | -87 |
|  Sun  9/16 | 1770 | 1592 | 178 |